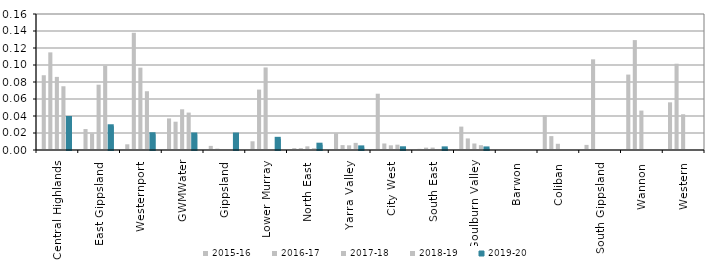
| Category | 2015-16 | 2016-17 | 2017-18 | 2018-19 | 2019-20 |
|---|---|---|---|---|---|
| Central Highlands  | 0.088 | 0.115 | 0.086 | 0.075 | 0.038 |
| East Gippsland  | 0.025 | 0.019 | 0.077 | 0.099 | 0.028 |
| Westernport  | 0.007 | 0.138 | 0.097 | 0.069 | 0.019 |
| GWMWater | 0.037 | 0.033 | 0.048 | 0.044 | 0.018 |
| Gippsland  | 0.005 | 0.002 | 0 | 0 | 0.018 |
| Lower Murray  | 0.01 | 0.071 | 0.097 | 0 | 0.013 |
| North East  | 0.002 | 0.002 | 0.004 | 0.002 | 0.006 |
| Yarra Valley  | 0.02 | 0.006 | 0.005 | 0.008 | 0.003 |
| City West  | 0.066 | 0.008 | 0.005 | 0.006 | 0.002 |
| South East  | 0.001 | 0.003 | 0.003 | 0 | 0.002 |
| Goulburn Valley  | 0.028 | 0.014 | 0.008 | 0.006 | 0.002 |
| Barwon  | 0 | 0 | 0 | 0 | 0 |
| Coliban  | 0.041 | 0.016 | 0.007 | 0 | 0 |
| South Gippsland  | 0.006 | 0.107 | 0 | 0 | 0 |
| Wannon  | 0.089 | 0.129 | 0.046 | 0 | 0 |
| Western  | 0.056 | 0.101 | 0.042 | 0 | 0 |